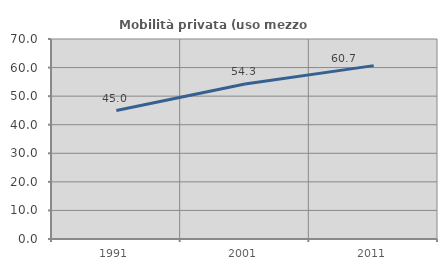
| Category | Mobilità privata (uso mezzo privato) |
|---|---|
| 1991.0 | 44.974 |
| 2001.0 | 54.252 |
| 2011.0 | 60.684 |